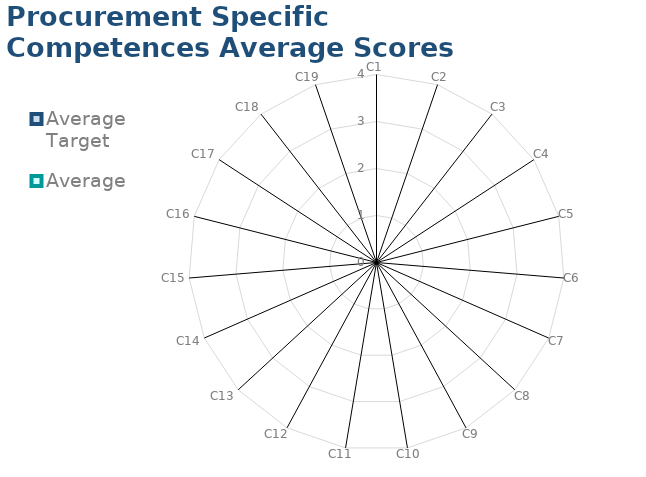
| Category | Average Target | Average |
|---|---|---|
| C1 | 0 | 0 |
| C2 | 0 | 0 |
| C3 | 0 | 0 |
| C4 | 0 | 0 |
| C5 | 0 | 0 |
| C6 | 0 | 0 |
| C7 | 0 | 0 |
| C8 | 0 | 0 |
| C9 | 0 | 0 |
| C10 | 0 | 0 |
| C11 | 0 | 0 |
| C12 | 0 | 0 |
| C13 | 0 | 0 |
| C14 | 0 | 0 |
| C15 | 0 | 0 |
| C16 | 0 | 0 |
| C17 | 0 | 0 |
| C18 | 0 | 0 |
| C19 | 0 | 0 |